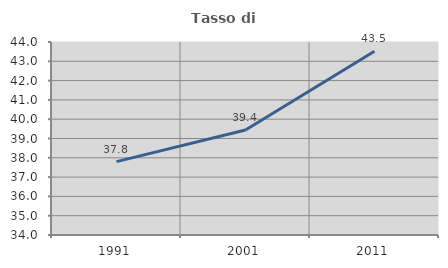
| Category | Tasso di occupazione   |
|---|---|
| 1991.0 | 37.803 |
| 2001.0 | 39.438 |
| 2011.0 | 43.523 |